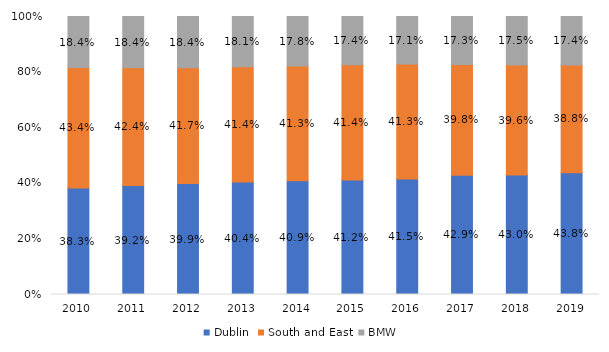
| Category | Dublin | South and East | BMW  |
|---|---|---|---|
| 2010.0 | 0.383 | 0.434 | 0.184 |
| 2011.0 | 0.392 | 0.424 | 0.184 |
| 2012.0 | 0.399 | 0.417 | 0.184 |
| 2013.0 | 0.404 | 0.414 | 0.181 |
| 2014.0 | 0.409 | 0.413 | 0.178 |
| 2015.0 | 0.412 | 0.414 | 0.174 |
| 2016.0 | 0.415 | 0.413 | 0.171 |
| 2017.0 | 0.429 | 0.398 | 0.173 |
| 2018.0 | 0.43 | 0.396 | 0.175 |
| 2019.0 | 0.438 | 0.388 | 0.174 |